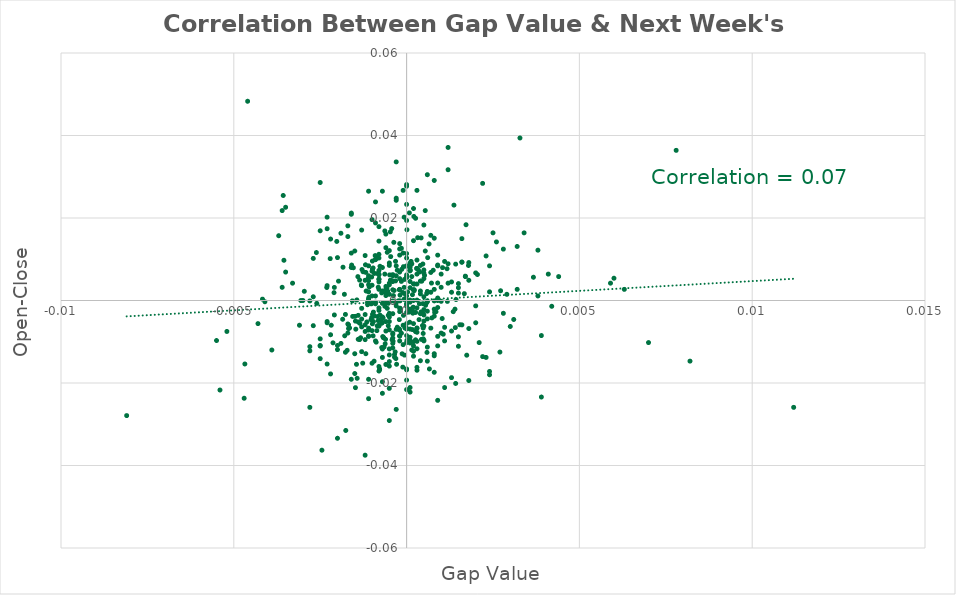
| Category | Series 0 |
|---|---|
| -0.000929999999999986 | 0.007 |
| -0.000110000000000054 | 0.002 |
| 0.000290000000000012 | 0.008 |
| 0.000439999999999995 | 0.005 |
| -0.00145000000000006 | -0.015 |
| -0.00143000000000004 | -0.019 |
| 0.000209999999999932 | 0.02 |
| -0.000769999999999937 | -0.004 |
| -0.00148000000000003 | -0.005 |
| 0.0 | 0 |
| 0.000219999999999998 | 0.002 |
| -0.00102000000000002 | -0.001 |
| -0.000360000000000027 | 0.002 |
| 0.000720000000000053 | 0.004 |
| 0.000589999999999979 | -0.013 |
| 0.000260000000000038 | 0.02 |
| -8.99999999999234e-05 | 0.008 |
| 0.000900000000000011 | 0.004 |
| 0.00141000000000002 | -0.007 |
| -0.00118000000000007 | 0.007 |
| 0.000219999999999998 | 0.004 |
| 0.000149999999999983 | -0.012 |
| -0.000580000000000024 | 0.003 |
| -0.00165000000000004 | -0.007 |
| -0.000700000000000033 | -0.012 |
| -0.000630000000000019 | -0.001 |
| -0.000929999999999986 | -0.004 |
| -0.00202000000000002 | 0.014 |
| 0.000170000000000003 | 0.001 |
| 0.000369999999999981 | -0.001 |
| 0.000380000000000047 | 0.007 |
| -0.000400000000000067 | 0.006 |
| -0.00132999999999994 | -0.009 |
| -0.00177000000000004 | -0.003 |
| -0.00156 | -0.004 |
| -0.000900000000000011 | -0.001 |
| 0.000730000000000008 | -0.004 |
| -0.000989999999999935 | 0.01 |
| 0.000360000000000027 | -0.005 |
| -0.000149999999999983 | -0.008 |
| -0.00306000000000006 | 0 |
| 0.00102999999999997 | -0.004 |
| -0.000209999999999932 | -0.005 |
| -0.000189999999999912 | -0.002 |
| -0.000390000000000001 | -0.01 |
| -0.000669999999999948 | -0.009 |
| 0.00153999999999998 | -0.006 |
| -0.000780000000000002 | -0.017 |
| -0.000269999999999992 | 0.007 |
| -0.000199999999999978 | -0.009 |
| -0.00197000000000002 | 0.005 |
| -8.99999999999234e-05 | -0.004 |
| -0.000419999999999975 | -0.01 |
| 0.000539999999999984 | 0.022 |
| -0.000879999999999991 | -0.01 |
| -0.000470000000000081 | 0.005 |
| -0.00109000000000003 | 0.001 |
| -0.00148000000000003 | -0.021 |
| -0.000190000000000023 | 0 |
| 0.000519999999999964 | 0.006 |
| -0.000209999999999932 | 0.003 |
| -0.00143999999999999 | 0 |
| -0.000609999999999999 | -0.009 |
| -0.000380000000000047 | 0.001 |
| -0.00114999999999998 | -0.005 |
| -0.00177000000000004 | -0.013 |
| -0.00209000000000003 | -0.004 |
| -0.00107999999999997 | 0.003 |
| -0.000419999999999975 | 0.005 |
| -0.00175999999999998 | -0.032 |
| -0.000499999999999944 | -0.012 |
| -0.000110000000000054 | -0.016 |
| -6.99999999999034e-05 | 0.02 |
| -0.000969999999999915 | -0.009 |
| -0.00168000000000001 | -0.006 |
| 0.000580000000000024 | 0.002 |
| 0.000400000000000067 | 0.005 |
| 0.00141999999999997 | -0.02 |
| -0.00129999999999996 | 0.017 |
| -0.00244999999999995 | -0.036 |
| 0.00327999999999995 | 0.039 |
| -0.00357000000000007 | 0.025 |
| -0.00468000000000001 | -0.015 |
| -0.00350000000000005 | 0.007 |
| 0.00109999999999999 | 0.009 |
| 0.000180000000000069 | -0.003 |
| 0.000499999999999944 | 0.007 |
| -0.00261 | 0.012 |
| -7.00000000000145e-05 | 0 |
| 0.000219999999999998 | 0.003 |
| -0.00055000000000005 | 0.002 |
| -0.000820000000000042 | 0.003 |
| -0.000620000000000064 | -0.011 |
| 0.00118000000000007 | 0 |
| -0.00097999999999998 | -0.003 |
| 0.00174000000000007 | -0.013 |
| 0.000569999999999959 | -0.001 |
| 9.99999999995449e-06 | 0 |
| 0.000480000000000036 | -0.007 |
| 0.000609999999999999 | 0.01 |
| 0.000260000000000038 | -0.008 |
| -0.000569999999999959 | 0.003 |
| -0.000720000000000053 | -0.006 |
| -0.00097999999999998 | -0.003 |
| -0.00095999999999996 | -0.003 |
| 0.000480000000000036 | -0.003 |
| -0.000909999999999966 | 0.011 |
| -0.00131000000000003 | 0.004 |
| -0.00117999999999995 | -0.013 |
| -0.00126000000000003 | 0.007 |
| -7.00000000000145e-05 | 0.003 |
| 0.000199999999999978 | 0.004 |
| -0.00141000000000002 | 0.006 |
| -0.000320000000000098 | 0.009 |
| -0.000149999999999983 | 0.013 |
| -4.99999999999944e-05 | -0.007 |
| 0.000170000000000003 | -0.007 |
| 0.000129999999999963 | 0.009 |
| -0.000350000000000072 | -0.013 |
| 0.0001000000000001 | -0.01 |
| -0.00046999999999997 | 0.017 |
| -0.000130000000000074 | -0.013 |
| -4.99999999999944e-05 | 0.002 |
| 0.000850000000000017 | -0.003 |
| -0.000990000000000046 | 0.007 |
| -0.00417 | 0 |
| -0.000190000000000023 | 0.001 |
| -0.000720000000000053 | 0.002 |
| -0.000139999999999918 | 0.008 |
| -0.00053000000000003 | -0.004 |
| 0.00141999999999997 | 0.009 |
| 0.00104000000000004 | 0.008 |
| 0.000259999999999927 | -0.003 |
| -0.000960000000000071 | -0.005 |
| 0.00272000000000005 | 0.002 |
| 0.00204999999999999 | 0.006 |
| -0.00059000000000009 | 0.002 |
| -0.000329999999999941 | -0.012 |
| 0.000319999999999987 | 0.015 |
| -0.00168000000000001 | -0.007 |
| 0.000259999999999927 | -0.01 |
| -0.000769999999999937 | 0.008 |
| 0.000480000000000036 | -0.009 |
| 0.000179999999999958 | -0.003 |
| 0.00166999999999994 | 0.002 |
| 0.000150000000000094 | 0.009 |
| 0.000770000000000048 | 0.007 |
| 0.00367000000000006 | 0.006 |
| -0.00171999999999994 | -0.012 |
| -0.00119000000000002 | 0.009 |
| -0.000940000000000051 | -0.015 |
| -0.00212999999999996 | -0.01 |
| -5.99999999999489e-05 | -0.013 |
| 0.00178999999999995 | 0.008 |
| -0.000669999999999948 | -0.009 |
| 0.000299999999999967 | -0.007 |
| -0.000430000000000041 | 0.017 |
| -0.00110999999999994 | 0.005 |
| -0.000349999999999961 | -0.014 |
| -0.000560000000000004 | -0.002 |
| -0.000970000000000026 | 0.008 |
| -0.00100999999999995 | 0.006 |
| -0.000849999999999906 | -0.006 |
| -0.000269999999999992 | -0.006 |
| 9.99999999995449e-06 | 0.017 |
| -0.000149999999999983 | 0.005 |
| -0.00156999999999996 | 0 |
| -0.000759999999999982 | -0.005 |
| -0.000840000000000062 | 0.007 |
| 0.000460000000000016 | -0.006 |
| 0.000650000000000039 | 0.014 |
| -0.00117 | 0.002 |
| -0.00129000000000001 | 0.008 |
| -0.00135000000000007 | -0.006 |
| 9.99999999999889e-05 | -0.007 |
| -0.000239999999999907 | 0 |
| -0.000499999999999944 | 0.004 |
| 0.000149999999999983 | 0.006 |
| -0.00048999999999999 | 0.006 |
| -0.000560000000000004 | 0.012 |
| -0.000369999999999981 | 0.014 |
| -0.000689999999999968 | -0.009 |
| -0.000679999999999902 | -0.004 |
| -0.000309999999999921 | -0.001 |
| 0.000189999999999912 | -0.002 |
| 0.00117 | 0.008 |
| -0.000820000000000042 | -0.005 |
| -5.99999999999489e-05 | 0.005 |
| -0.00184000000000006 | 0.008 |
| -0.00126999999999999 | -0.015 |
| -0.00231000000000003 | 0.003 |
| -0.00209000000000003 | 0.003 |
| 0.000480000000000036 | -0.008 |
| -0.00148999999999999 | -0.004 |
| -0.00119999999999997 | -0.009 |
| 0.000600000000000044 | -0.003 |
| -0.000290000000000012 | -0.015 |
| -0.00295999999999996 | 0.002 |
| 0.000549999999999939 | -0.001 |
| -0.00146999999999997 | -0.007 |
| -0.000859999999999971 | 0.01 |
| 3.00000000000855e-05 | -0.002 |
| -0.00100999999999995 | -0.004 |
| -0.000990000000000046 | 0.008 |
| 7.99999999999689e-05 | 0.021 |
| -0.00249999999999994 | -0.011 |
| 0.000539999999999984 | 0.012 |
| -0.00354999999999994 | 0.01 |
| -0.000990000000000046 | -0.006 |
| 7.00000000000145e-05 | -0.003 |
| -0.000650000000000039 | -0.011 |
| 0.000120000000000009 | 0.009 |
| 0.000339999999999895 | 0.007 |
| -0.00112999999999996 | 0 |
| -0.00153999999999998 | 0.008 |
| -0.00158999999999998 | 0.009 |
| -0.00109999999999999 | -0.007 |
| -0.000720000000000053 | -0.011 |
| -0.000859999999999971 | -0.007 |
| -0.000319999999999987 | 0.005 |
| 9.00000000000345e-05 | -0.005 |
| 0.000419999999999975 | -0.003 |
| -0.00102999999999997 | -0.005 |
| -0.00178999999999995 | -0.009 |
| -0.00136000000000002 | -0.009 |
| -0.000309999999999921 | -0.014 |
| 0.000299999999999967 | -0.007 |
| -0.00135999999999991 | 0.005 |
| -0.00053000000000003 | -0.006 |
| 0.00171999999999994 | 0.018 |
| -0.000840000000000062 | -0.004 |
| -0.000210000000000043 | -0.007 |
| -0.000630000000000019 | 0.006 |
| 0.000190000000000023 | 0.003 |
| 0.00046999999999997 | -0.001 |
| 0.00105999999999995 | -0.008 |
| -0.00220999999999993 | 0.01 |
| 0.000419999999999975 | 0.015 |
| 0.00143000000000004 | 0 |
| 2.99999999999744e-05 | 0.002 |
| -0.000460000000000016 | 0.011 |
| 0.000600000000000044 | -0.004 |
| 1.00000000000655e-05 | -0.01 |
| -0.00218000000000007 | -0.006 |
| 0.000659999999999993 | -0.017 |
| 0.00135000000000007 | -0.003 |
| 0.000809999999999977 | -0.003 |
| 0.000399999999999955 | 0.008 |
| -0.000630000000000019 | 0.017 |
| -0.00112999999999996 | -0.001 |
| 0.00042999999999993 | -0.009 |
| -0.00185000000000001 | -0.005 |
| 0.00280000000000002 | 0.012 |
| 0.00136999999999998 | 0.023 |
| -0.000780000000000002 | -0.017 |
| -0.000529999999999919 | -0.001 |
| 0.000260000000000038 | -0.007 |
| 0.00046999999999997 | 0.009 |
| 0.0 | 0.011 |
| 0.000800000000000022 | -0.004 |
| -0.000700000000000033 | 0.002 |
| -0.000199999999999978 | 0.005 |
| -0.00129999999999996 | -0.004 |
| -0.000800000000000022 | -0.006 |
| -0.00269999999999992 | 0.001 |
| -0.00109999999999999 | -0.009 |
| -9.99999999999889e-05 | -0.006 |
| -0.000199999999999978 | 0.007 |
| -0.000499999999999944 | -0.021 |
| 0.00259999999999993 | 0.014 |
| -0.000799999999999911 | 0.018 |
| -0.000699999999999922 | -0.014 |
| -0.00549999999999994 | -0.01 |
| 0.002 | -0.005 |
| 0.000199999999999978 | 0 |
| -0.000400000000000067 | -0.01 |
| -0.000299999999999967 | -0.026 |
| 9.99999999999889e-05 | 0.007 |
| -0.000399999999999955 | 0 |
| -0.00109999999999999 | 0.006 |
| -0.000199999999999978 | 0.014 |
| -0.000500000000000056 | -0.013 |
| -0.00359999999999993 | 0.003 |
| 0.000199999999999978 | -0.011 |
| -0.00160000000000004 | 0.008 |
| -0.000700000000000033 | -0.023 |
| -0.000900000000000011 | 0.01 |
| -0.00129999999999996 | -0.006 |
| -0.00329999999999997 | 0.004 |
| -0.00469999999999992 | -0.024 |
| 0.00149999999999994 | 0.002 |
| -0.00129999999999996 | -0.002 |
| -0.000699999999999922 | -0.001 |
| 0.000800000000000022 | -0.013 |
| 0.000499999999999944 | 0.001 |
| -0.00519999999999998 | -0.008 |
| 0.00159999999999993 | 0.009 |
| -0.00250000000000005 | 0.029 |
| 0.000299999999999967 | -0.002 |
| -9.99999999999889e-05 | -0.011 |
| -0.000299999999999967 | -0.001 |
| -0.000399999999999955 | 0.003 |
| 9.99999999999889e-05 | -0.021 |
| -0.000199999999999978 | 0.003 |
| 0.000500000000000056 | -0.002 |
| 0.0 | -0.001 |
| -0.00359999999999993 | 0.022 |
| -0.000500000000000056 | -0.003 |
| -0.000799999999999911 | 0.005 |
| -0.00149999999999994 | -0.013 |
| 0.000900000000000011 | -0.024 |
| -0.00170000000000003 | -0.008 |
| -0.000900000000000011 | 0.001 |
| -0.000399999999999955 | -0.009 |
| 0.002 | -0.001 |
| 0.000499999999999944 | 0.018 |
| -0.00229999999999996 | 0.02 |
| 0.000400000000000067 | -0.015 |
| -0.000700000000000033 | 0.008 |
| 0.000800000000000022 | -0.002 |
| -0.000799999999999911 | -0.002 |
| 0.0 | -0.006 |
| -0.00169999999999992 | 0.018 |
| -0.00229999999999996 | -0.005 |
| -0.000799999999999911 | 0.014 |
| -0.000799999999999911 | 0.006 |
| 0.000299999999999967 | 0.008 |
| -0.000299999999999967 | 0.006 |
| -0.00229999999999996 | 0.004 |
| 0.0 | 0.019 |
| -0.00219999999999998 | 0.015 |
| -0.00260000000000004 | -0.001 |
| -0.00109999999999999 | 0.004 |
| 0.0 | 0.006 |
| 0.00229999999999996 | 0.011 |
| -0.000500000000000056 | -0.016 |
| 0.0 | 0.006 |
| -0.00120000000000009 | -0.003 |
| 0.00240000000000006 | 0.002 |
| -0.00109999999999999 | -0.024 |
| 0.001 | 0.003 |
| -0.001 | 0.02 |
| 0.000500000000000056 | -0.003 |
| 0.00309999999999999 | -0.005 |
| -0.000900000000000011 | -0.01 |
| 9.99999999999889e-05 | -0.01 |
| -0.00229999999999996 | 0.017 |
| -0.000299999999999967 | 0.034 |
| 0.00170000000000003 | 0.006 |
| -0.00229999999999996 | -0.015 |
| -0.000800000000000022 | 0.005 |
| -0.000199999999999978 | -0.002 |
| 9.99999999999889e-05 | 0.003 |
| -0.001 | -0.007 |
| -0.002 | 0.01 |
| -0.000399999999999955 | 0.005 |
| 0.0041000000000001 | 0.006 |
| 0.00219999999999998 | -0.014 |
| -0.00209999999999999 | 0.002 |
| -0.000399999999999955 | 0.006 |
| 0.000700000000000033 | 0.007 |
| 0.000500000000000056 | -0.01 |
| -0.000500000000000056 | -0.005 |
| 0.000299999999999967 | 0.01 |
| 0.00219999999999998 | 0.028 |
| 0.000399999999999955 | 0.002 |
| -0.00190000000000001 | 0.016 |
| -0.000700000000000033 | 0.002 |
| -0.001 | 0.004 |
| 0.0 | 0.008 |
| 0.000900000000000011 | -0.002 |
| -0.000500000000000056 | 0.004 |
| 9.99999999999889e-05 | 0.005 |
| 0.00159999999999993 | 0.015 |
| -0.000199999999999978 | 0.012 |
| 0.000700000000000033 | -0.007 |
| 0.000299999999999967 | 0.004 |
| 0.000299999999999967 | -0.008 |
| -0.000400000000000067 | -0.003 |
| 0.000299999999999967 | -0.017 |
| -0.000600000000000044 | -0.001 |
| -0.000800000000000022 | 0.004 |
| 0.000900000000000011 | 0.009 |
| 0.001 | 0 |
| 0.000500000000000056 | 0.005 |
| 0.0 | -0.008 |
| -0.001 | -0.001 |
| 0.0 | 0.01 |
| -0.00190000000000001 | -0.01 |
| 0.001 | 0.006 |
| 0.000599999999999933 | -0.011 |
| 0.000300000000000078 | 0 |
| 0.000499999999999944 | -0.006 |
| -0.00249999999999994 | -0.011 |
| 0.000300000000000078 | -0.01 |
| -0.000499999999999944 | 0.009 |
| -0.00109999999999999 | -0.009 |
| 0.00180000000000002 | -0.019 |
| 0.000199999999999978 | 0.014 |
| -0.000799999999999911 | 0.003 |
| -0.000599999999999933 | 0.003 |
| 0.0 | -0.003 |
| 0.000900000000000011 | -0.011 |
| 0.00170000000000003 | 0.006 |
| 9.99999999999889e-05 | 0.007 |
| 0.000600000000000044 | 0.002 |
| 0.00270000000000003 | -0.012 |
| -0.00109999999999999 | 0.005 |
| 0.00340000000000007 | 0.016 |
| 0.00159999999999993 | -0.006 |
| -0.001 | 0.001 |
| 0.000700000000000033 | 0.002 |
| -0.00160000000000004 | 0.021 |
| -0.000700000000000033 | -0.02 |
| 9.99999999999889e-05 | 0 |
| -0.000499999999999944 | -0.004 |
| -0.001 | 0.007 |
| 0.00819999999999998 | -0.015 |
| 0.000800000000000022 | -0.013 |
| 0.00390000000000001 | -0.023 |
| 0.000900000000000011 | 0.008 |
| 0.000600000000000044 | 0.031 |
| -0.000299999999999967 | -0.007 |
| -0.00809999999999999 | -0.028 |
| -0.000299999999999967 | 0.024 |
| 0.00239999999999995 | -0.018 |
| 0.00390000000000001 | -0.008 |
| -0.000599999999999933 | -0.005 |
| -0.000600000000000044 | 0.001 |
| 0.000400000000000067 | 0.002 |
| 0.00120000000000009 | 0.032 |
| -0.00539999999999996 | -0.022 |
| 0.00240000000000006 | 0.008 |
| 0.00250000000000005 | 0.016 |
| 0.00290000000000001 | 0.002 |
| 0.000199999999999978 | 0.022 |
| -0.000900000000000011 | 0.024 |
| 0.000499999999999944 | -0.005 |
| -0.00119999999999997 | -0.008 |
| -0.00170000000000003 | 0.016 |
| -0.00219999999999998 | -0.018 |
| -0.000500000000000056 | -0.007 |
| -0.000800000000000022 | -0.002 |
| -0.0038999999999999 | -0.012 |
| -0.00109999999999999 | -0.007 |
| -0.00180000000000002 | 0.001 |
| -0.00159999999999993 | 0.012 |
| -0.000799999999999911 | 0.006 |
| 0.00150000000000005 | -0.009 |
| 0.00319999999999998 | 0.013 |
| -0.00139999999999995 | -0.009 |
| 9.99999999999889e-05 | 0 |
| 0.00319999999999998 | 0.003 |
| 0.000199999999999978 | -0.006 |
| 0.000199999999999978 | -0.01 |
| 0.00119999999999997 | 0.004 |
| 0.0 | 0.023 |
| 0.000199999999999978 | -0.013 |
| 0.000299999999999967 | -0.012 |
| -0.000200000000000089 | 0.003 |
| 0.00109999999999999 | -0.01 |
| 0.000799999999999911 | 0.003 |
| -0.000900000000000011 | 0.01 |
| -0.000199999999999978 | -0.003 |
| -0.000199999999999978 | -0.007 |
| 0.00129999999999996 | 0.002 |
| -0.00109999999999999 | 0 |
| -0.000800000000000022 | 0.011 |
| 0.000900000000000011 | 0 |
| 0.000900000000000011 | 0.001 |
| -0.00150000000000005 | -0.018 |
| -0.00279999999999991 | -0.012 |
| 0.00119999999999997 | 0.009 |
| 0.000400000000000067 | -0.003 |
| -0.00119999999999997 | 0.005 |
| 0.0 | 0.006 |
| 0.0008999999999999 | -0.009 |
| -0.002 | -0.012 |
| 0.00140000000000006 | -0.002 |
| -0.000499999999999944 | 0.002 |
| -0.000599999999999933 | 0.003 |
| -0.000399999999999955 | -0.011 |
| 0.00380000000000002 | 0.001 |
| 0.007 | -0.01 |
| -0.000800000000000022 | -0.017 |
| 0.006 | 0.005 |
| 0.00149999999999994 | 0.004 |
| -9.99999999999889e-05 | 0.027 |
| -0.00270000000000003 | 0.01 |
| 0.000299999999999967 | 0.027 |
| -0.00139999999999995 | -0.005 |
| 0.002 | 0.007 |
| -0.00270000000000003 | -0.006 |
| 0.00590000000000001 | 0.004 |
| -0.0008999999999999 | 0 |
| 0.000299999999999967 | 0.006 |
| -0.00309999999999999 | -0.006 |
| 0.00160000000000004 | 0.009 |
| 0.000500000000000056 | 0.007 |
| 0.00629999999999997 | 0.003 |
| 0.00279999999999991 | -0.003 |
| 9.99999999999889e-05 | 0.009 |
| -0.00130000000000007 | -0.012 |
| 0.000799999999999911 | -0.017 |
| -0.00249999999999994 | -0.014 |
| -0.001 | -0.015 |
| -0.000700000000000033 | -0.004 |
| -0.00229999999999996 | -0.005 |
| 0.00209999999999999 | -0.01 |
| -0.000600000000000044 | 0.013 |
| 0.00440000000000007 | 0.006 |
| 0.0111999999999999 | -0.026 |
| -0.000599999999999933 | 0.016 |
| 0.00779999999999991 | 0.036 |
| 0.00380000000000002 | 0.012 |
| -0.000700000000000033 | 0.026 |
| -0.00109999999999999 | -0.019 |
| -0.00280000000000002 | 0 |
| -0.00120000000000009 | -0.038 |
| 0.00109999999999999 | -0.007 |
| 0.000800000000000022 | 0.015 |
| -0.00460000000000004 | 0.048 |
| -0.000600000000000044 | -0.007 |
| -0.00350000000000005 | 0.023 |
| 0.00180000000000002 | -0.007 |
| 0.00109999999999999 | -0.021 |
| 0.000700000000000033 | 0.016 |
| -0.000799999999999911 | 0.01 |
| 0.00119999999999997 | 0.037 |
| -0.000599999999999933 | -0.015 |
| 0.00130000000000007 | -0.019 |
| -0.00250000000000005 | -0.009 |
| 0.000500000000000056 | -0.01 |
| -0.00160000000000004 | -0.019 |
| -0.003 | 0 |
| -0.000800000000000022 | 0.007 |
| -0.000800000000000022 | -0.006 |
| -0.00109999999999999 | 0.002 |
| -0.00280000000000002 | -0.026 |
| -0.002 | -0.011 |
| 0.00130000000000007 | 0.005 |
| -0.000900000000000011 | 0.019 |
| -0.000200000000000089 | -0.009 |
| 9.99999999999889e-05 | -0.002 |
| 0.000299999999999967 | -0.016 |
| 0.000600000000000044 | -0.015 |
| -0.000500000000000056 | -0.015 |
| 9.99999999999889e-05 | -0.022 |
| -0.00120000000000009 | 0.011 |
| -0.00119999999999997 | -0.006 |
| -0.00149999999999994 | 0.012 |
| 0.000900000000000011 | 0.011 |
| -0.00429999999999997 | -0.006 |
| -0.0011000000000001 | 0.008 |
| -0.00409999999999999 | 0 |
| -0.000800000000000022 | -0.016 |
| 0.00179999999999991 | 0.009 |
| -0.00220000000000009 | -0.008 |
| -0.00370000000000003 | 0.016 |
| -0.002 | -0.033 |
| 0.000199999999999978 | -0.012 |
| -0.000199999999999978 | 0.011 |
| -0.00250000000000005 | 0.017 |
| 0.00229999999999996 | -0.014 |
| 0.000799999999999911 | 0.029 |
| 0.00419999999999998 | -0.001 |
| -0.00159999999999993 | 0.021 |
| -0.000499999999999944 | -0.029 |
| 0.00239999999999995 | -0.017 |
| -0.000499999999999944 | 0.009 |
| 0.000800000000000022 | 0 |
| 0.00149999999999994 | -0.011 |
| 0.00129999999999996 | -0.007 |
| 0.001 | -0.008 |
| 0.00180000000000002 | 0.005 |
| -0.00280000000000002 | -0.011 |
| 0.003 | -0.006 |
| -0.00170000000000003 | -0.006 |
| 0.000600000000000044 | 0 |
| -0.00109999999999999 | 0.026 |
| -0.000400000000000067 | -0.008 |
| -0.00109999999999999 | 0 |
| 0.0 | -0.017 |
| 0.000600000000000044 | 0 |
| 0.0 | -0.022 |
| -0.000299999999999967 | 0.025 |
| 0.0 | -0.007 |
| 0.0 | -0.017 |
| 0.0 | -0.019 |
| 0.0 | 0.008 |
| 0.0 | -0.001 |
| 0.0 | 0.028 |
| 9.99999999999889e-05 | 0.008 |
| -0.000500000000000056 | 0.012 |
| -0.000199999999999978 | -0.01 |
| 9.99999999999889e-05 | -0.009 |
| 0.0001000000000001 | 0.007 |
| 0.0 | -0.01 |
| 0.000200000000000089 | -0.002 |
| -0.00129999999999996 | 0.004 |
| 0.0 | -0.007 |
| -0.000700000000000033 | -0.005 |
| 0.0 | 0.001 |
| 0.00149999999999994 | 0.003 |
| -0.00139999999999995 | -0.004 |
| -0.000400000000000067 | -0.008 |
| -9.99999999999889e-05 | 0.011 |
| -0.000299999999999967 | 0.008 |
| 0.0 | 0.028 |
| 0.0 | -0.001 |